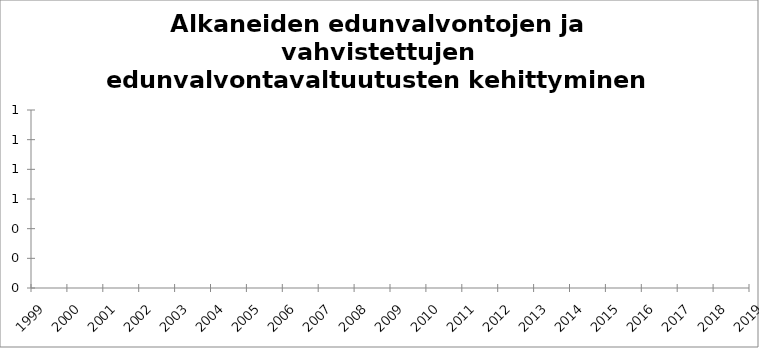
| Category | Series 0 |
|---|---|
| 1999 | 2030 |
| 2000 | 2710 |
| 2001 | 3379 |
| 2002 | 3790 |
| 2003 | 4158 |
| 2004 | 5095 |
| 2005 | 5346 |
| 2006 | 5976 |
| 2007 | 6820 |
| 2008 | 8048 |
| 2009 | 8220 |
| 2010 | 7972 |
| 2011 | 8127 |
| 2012 | 8450 |
| 2013 | 8938 |
| 2014 | 9461 |
| 2015 | 9898 |
| 2016 | 10972 |
| 2017 | 12008 |
| 2018 | 12911 |
| 2019 | 13306 |